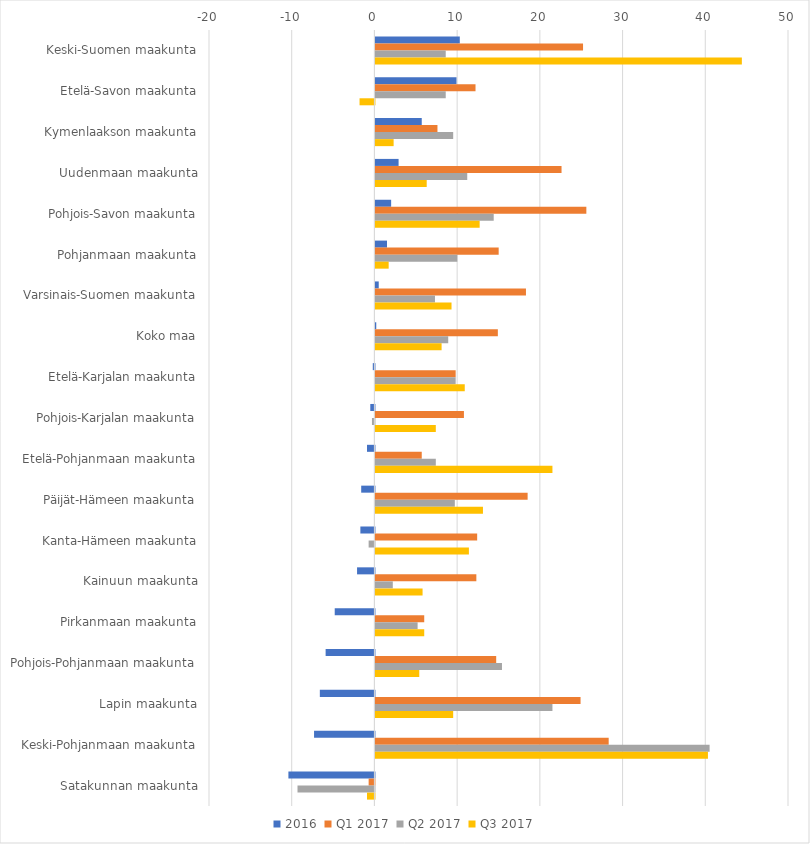
| Category | 2016 | Q1 2017 | Q2 2017 | Q3 2017 |
|---|---|---|---|---|
| Keski-Suomen maakunta | 10.2 | 25.1 | 8.5 | 44.3 |
| Etelä-Savon maakunta | 9.8 | 12.1 | 8.5 | -1.8 |
| Kymenlaakson maakunta | 5.6 | 7.5 | 9.4 | 2.2 |
| Uudenmaan maakunta | 2.8 | 22.5 | 11.1 | 6.2 |
| Pohjois-Savon maakunta | 1.9 | 25.5 | 14.3 | 12.6 |
| Pohjanmaan maakunta | 1.4 | 14.9 | 9.9 | 1.6 |
| Varsinais-Suomen maakunta | 0.4 | 18.2 | 7.2 | 9.2 |
| Koko maa | 0.1 | 14.8 | 8.8 | 8 |
| Etelä-Karjalan maakunta | -0.2 | 9.7 | 9.7 | 10.8 |
| Pohjois-Karjalan maakunta | -0.5 | 10.7 | -0.3 | 7.3 |
| Etelä-Pohjanmaan maakunta | -0.9 | 5.6 | 7.3 | 21.4 |
| Päijät-Hämeen maakunta | -1.6 | 18.4 | 9.6 | 13 |
| Kanta-Hämeen maakunta | -1.7 | 12.3 | -0.7 | 11.3 |
| Kainuun maakunta | -2.1 | 12.2 | 2.1 | 5.7 |
| Pirkanmaan maakunta | -4.8 | 5.9 | 5.1 | 5.9 |
| Pohjois-Pohjanmaan maakunta | -5.9 | 14.6 | 15.3 | 5.3 |
| Lapin maakunta | -6.6 | 24.8 | 21.4 | 9.4 |
| Keski-Pohjanmaan maakunta | -7.3 | 28.2 | 40.4 | 40.2 |
| Satakunnan maakunta | -10.4 | -0.7 | -9.3 | -0.9 |